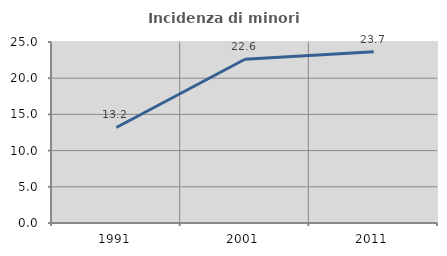
| Category | Incidenza di minori stranieri |
|---|---|
| 1991.0 | 13.192 |
| 2001.0 | 22.613 |
| 2011.0 | 23.653 |